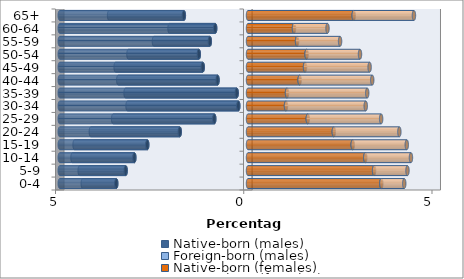
| Category | Native-born (males) | Foreign-born (males) | Native-born (females) | Foreign-born (females) |
|---|---|---|---|---|
| 0-4 | -3.499 | -0.89 | 3.542 | 0.609 |
| 5-9 | -3.249 | -1.222 | 3.348 | 0.887 |
| 10-14 | -3.018 | -1.644 | 3.115 | 1.213 |
| 15-19 | -2.676 | -1.931 | 2.781 | 1.437 |
| 20-24 | -1.813 | -2.362 | 2.279 | 1.741 |
| 25-29 | -0.896 | -2.686 | 1.587 | 1.949 |
| 30-34 | -0.257 | -2.942 | 1.009 | 2.118 |
| 35-39 | -0.3 | -2.952 | 1.036 | 2.131 |
| 40-44 | -0.808 | -2.637 | 1.371 | 1.929 |
| 45-49 | -1.202 | -2.315 | 1.515 | 1.716 |
| 50-54 | -1.306 | -1.87 | 1.556 | 1.419 |
| 55-59 | -1.014 | -1.485 | 1.303 | 1.142 |
| 60-64 | -0.871 | -1.213 | 1.222 | 0.89 |
| 65+ | -1.704 | -1.986 | 2.808 | 1.6 |